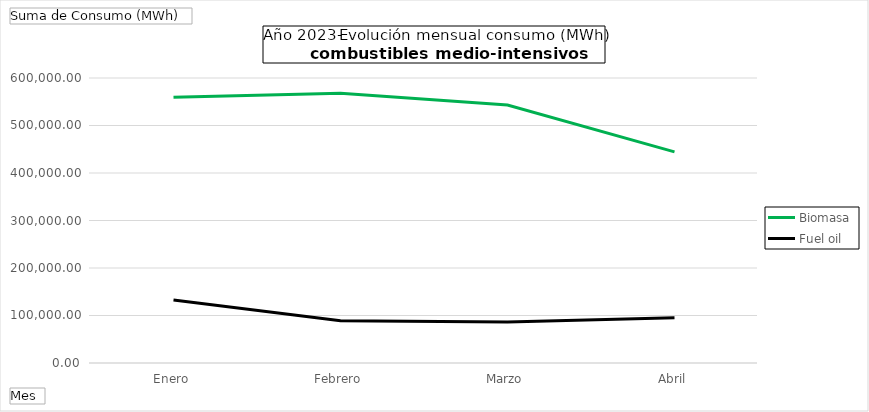
| Category | Biomasa | Fuel oil |
|---|---|---|
| Enero | 559533.61 | 132554.63 |
| Febrero | 567766.49 | 88948.18 |
| Marzo | 543216.95 | 86334.04 |
| Abril | 444563.39 | 95120.54 |